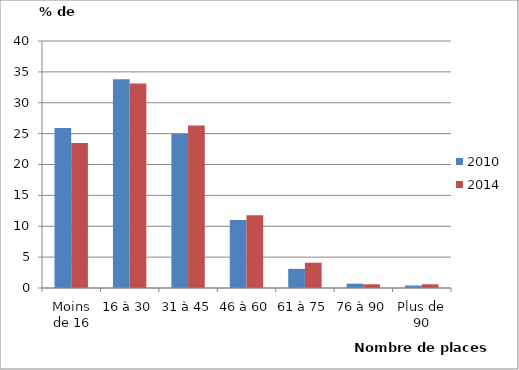
| Category | 2010 | 2014 |
|---|---|---|
| Moins de 16 | 25.9 | 23.5 |
| 16 à 30 | 33.8 | 33.1 |
| 31 à 45 | 25 | 26.3 |
| 46 à 60 | 11 | 11.8 |
| 61 à 75 | 3.1 | 4.1 |
| 76 à 90 | 0.7 | 0.6 |
| Plus de 90 | 0.4 | 0.6 |